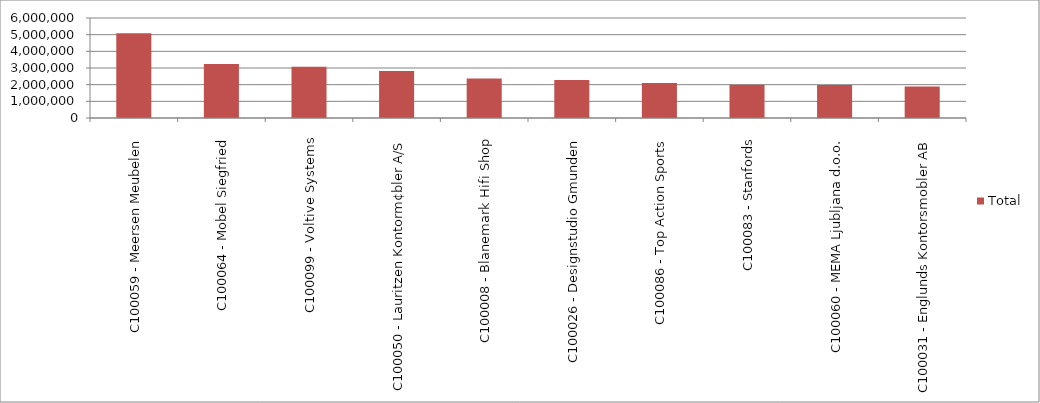
| Category | Total |
|---|---|
| C100059 - Meersen Meubelen | 5077654.66 |
| C100064 - Mobel Siegfried | 3243226.56 |
| C100099 - Voltive Systems | 3079515.34 |
| C100050 - Lauritzen Kontorm¢bler A/S | 2817277.88 |
| C100008 - Blanemark Hifi Shop | 2371646.73 |
| C100026 - Designstudio Gmunden | 2277671.82 |
| C100086 - Top Action Sports | 2093534.76 |
| C100083 - Stanfords | 2001475.75 |
| C100060 - MEMA Ljubljana d.o.o. | 1977739.06 |
| C100031 - Englunds Kontorsmobler AB | 1883684.35 |